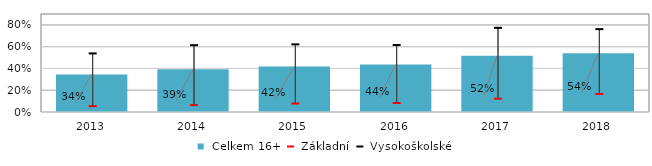
| Category |  Celkem 16+ |
|---|---|
| 2013.0 | 0.344 |
| 2014.0 | 0.393 |
| 2015.0 | 0.419 |
| 2016.0 | 0.436 |
| 2017.0 | 0.516 |
| 2018.0 | 0.539 |